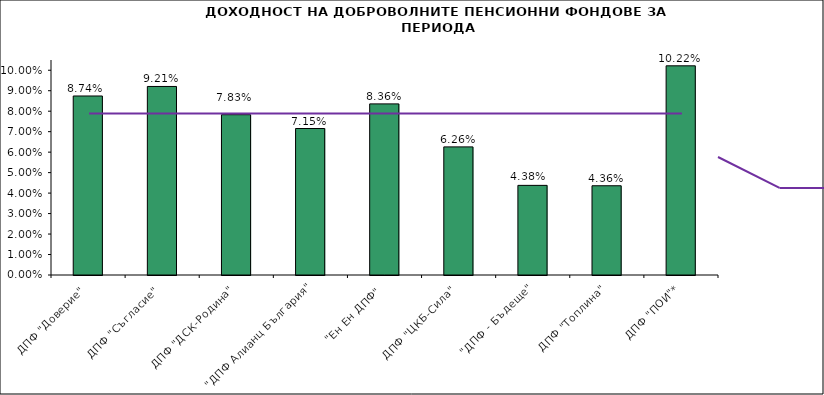
| Category | Series 0 |
|---|---|
| ДПФ "Доверие"  | 0.087 |
| ДПФ "Съгласие"  | 0.092 |
| ДПФ "ДСК-Родина"  | 0.078 |
| "ДПФ Алианц България"  | 0.072 |
| "Ен Ен ДПФ"  | 0.084 |
| ДПФ "ЦКБ-Сила"  | 0.063 |
| "ДПФ - Бъдеще" | 0.044 |
| ДПФ "Топлина" | 0.044 |
| ДПФ "ПОИ"* | 0.102 |